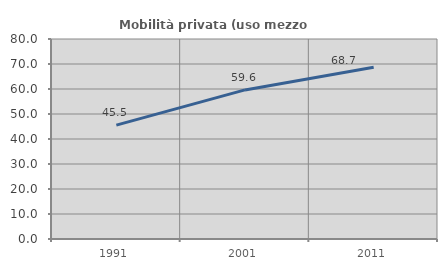
| Category | Mobilità privata (uso mezzo privato) |
|---|---|
| 1991.0 | 45.542 |
| 2001.0 | 59.635 |
| 2011.0 | 68.725 |